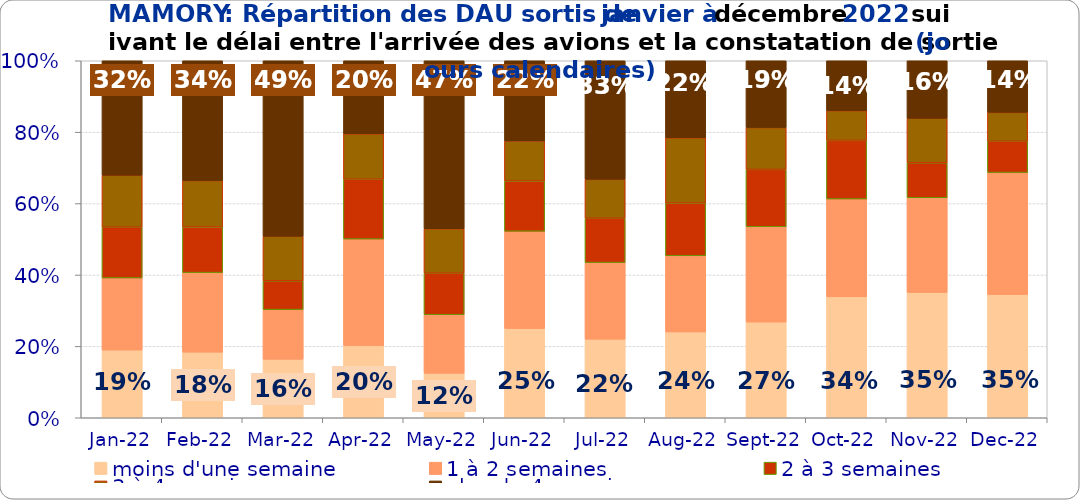
| Category | moins d'une semaine | 1 à 2 semaines | 2 à 3 semaines | 3 à 4 semaines | plus de 4 semaines |
|---|---|---|---|---|---|
| 2022-01-01 | 0.189 | 0.202 | 0.142 | 0.146 | 0.321 |
| 2022-02-01 | 0.184 | 0.223 | 0.128 | 0.13 | 0.336 |
| 2022-03-01 | 0.164 | 0.139 | 0.081 | 0.125 | 0.491 |
| 2022-04-01 | 0.202 | 0.298 | 0.168 | 0.127 | 0.205 |
| 2022-05-01 | 0.125 | 0.164 | 0.116 | 0.125 | 0.47 |
| 2022-06-01 | 0.25 | 0.272 | 0.141 | 0.112 | 0.224 |
| 2022-07-01 | 0.22 | 0.215 | 0.124 | 0.109 | 0.332 |
| 2022-08-01 | 0.24 | 0.213 | 0.148 | 0.183 | 0.216 |
| 2022-09-01 | 0.268 | 0.267 | 0.161 | 0.117 | 0.187 |
| 2022-10-01 | 0.339 | 0.274 | 0.164 | 0.083 | 0.14 |
| 2022-11-01 | 0.351 | 0.265 | 0.098 | 0.125 | 0.161 |
| 2022-12-01 | 0.345 | 0.341 | 0.088 | 0.081 | 0.144 |